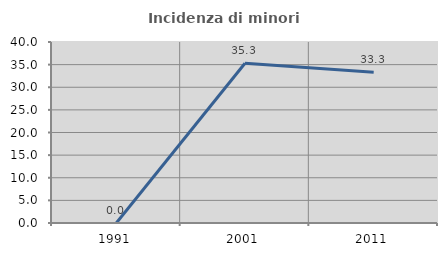
| Category | Incidenza di minori stranieri |
|---|---|
| 1991.0 | 0 |
| 2001.0 | 35.294 |
| 2011.0 | 33.333 |